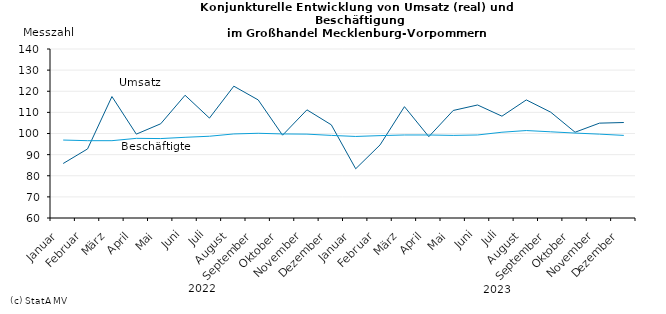
| Category | Umsatz | Beschäftigte |
|---|---|---|
|   Januar  | 85.8 | 96.9 |
|   Februar  | 92.7 | 96.6 |
|   März  | 117.5 | 96.6 |
|   April  | 99.7 | 97.7 |
|   Mai  | 104.6 | 97.6 |
|   Juni  | 118.1 | 98.2 |
|   Juli  | 107.3 | 98.7 |
|   August  | 122.4 | 99.8 |
|   September  | 115.9 | 100.1 |
|   Oktober  | 99.2 | 99.8 |
|   November  | 111.2 | 99.7 |
|   Dezember  | 104.1 | 99.1 |
|   Januar  | 83.3 | 98.6 |
|   Februar  | 94.6 | 99 |
|   März  | 112.7 | 99.3 |
|   April  | 98.5 | 99.3 |
|   Mai  | 110.9 | 99.1 |
|   Juni  | 113.5 | 99.3 |
|   Juli  | 108.2 | 100.6 |
|   August  | 115.9 | 101.4 |
|   September  | 110.1 | 100.8 |
|   Oktober  | 100.6 | 100.2 |
|   November  | 104.9 | 99.7 |
|   Dezember  | 105.2 | 99.1 |